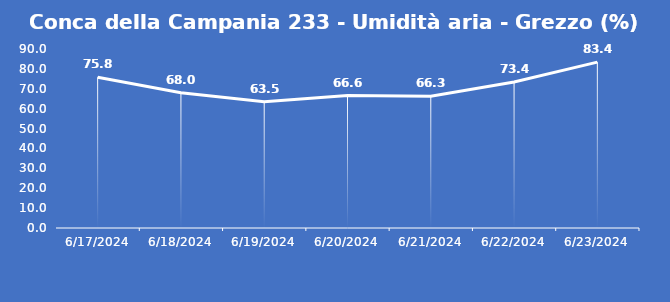
| Category | Conca della Campania 233 - Umidità aria - Grezzo (%) |
|---|---|
| 6/17/24 | 75.8 |
| 6/18/24 | 68 |
| 6/19/24 | 63.5 |
| 6/20/24 | 66.6 |
| 6/21/24 | 66.3 |
| 6/22/24 | 73.4 |
| 6/23/24 | 83.4 |